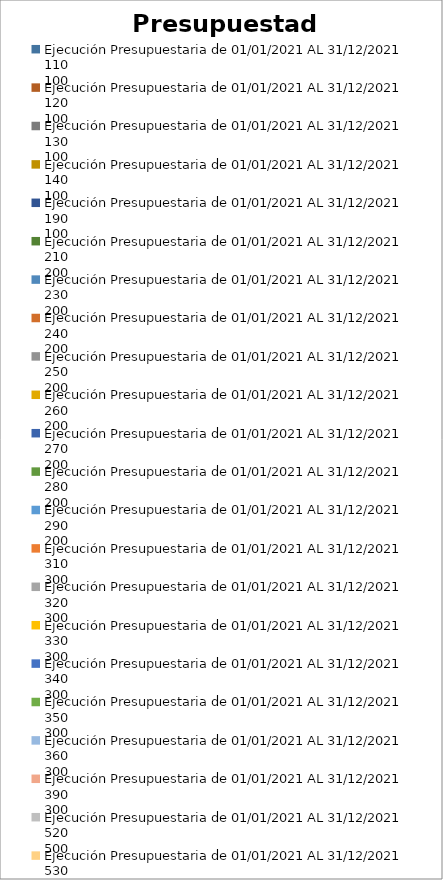
| Category | Presupuestado | Ejecutado | Saldos |
|---|---|---|---|
| 0 | 10984188800 | 10504725466 | 479463334 |
| 1 | 88900000 | 71962012 | 16937988 |
| 2 | 2986444322 | 2898949812 | 87494510 |
| 3 | 2464983984 | 2434632435 | 30351549 |
| 4 | 362880775 | 346128457 | 16752318 |
| 5 | 538852670 | 514114302 | 24738368 |
| 6 | 621026069 | 523691495 | 97334574 |
| 7 | 2007207202 | 941842269 | 1065364933 |
| 8 | 785891792 | 412380000 | 373511792 |
| 9 | 1121030905 | 517062538 | 603968367 |
| 10 | 2454900000 | 2272870000 | 182030000 |
| 11 | 112052000 | 46247000 | 65805000 |
| 12 | 107865768 | 90498480 | 17367288 |
| 13 | 41676600 | 41676600 | 0 |
| 14 | 58000000 | 43507905 | 14492095 |
| 15 | 77339250 | 77339250 | 0 |
| 16 | 305048888 | 304984896 | 63992 |
| 17 | 75000000 | 15511550 | 59488450 |
| 18 | 200000000 | 200000000 | 0 |
| 19 | 9505000 | 9505000 | 0 |
| 20 | 4781200042 | 3228847962 | 1552352080 |
| 21 | 1100000000 | 240642000 | 859358000 |
| 22 | 1610000000 | 689248028 | 920751972 |
| 23 | 75000000 | 46850000 | 28150000 |
| 24 | 420000000 | 136864000 | 283136000 |
| 25 | 2167900000 | 2069740000 | 98160000 |
| 26 | 1663444907 | 1663444907 | 0 |
| 27 | 153137384 | 10483120 | 142654264 |
| 28 | 37373476358 | 30353749484 | 7019726874 |